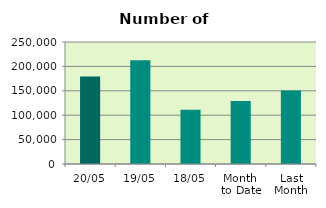
| Category | Series 0 |
|---|---|
| 20/05 | 179050 |
| 19/05 | 212358 |
| 18/05 | 111120 |
| Month 
to Date | 129332.462 |
| Last
Month | 150855.6 |